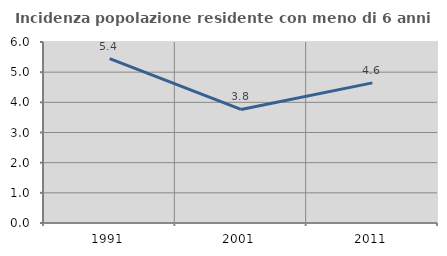
| Category | Incidenza popolazione residente con meno di 6 anni |
|---|---|
| 1991.0 | 5.45 |
| 2001.0 | 3.764 |
| 2011.0 | 4.644 |